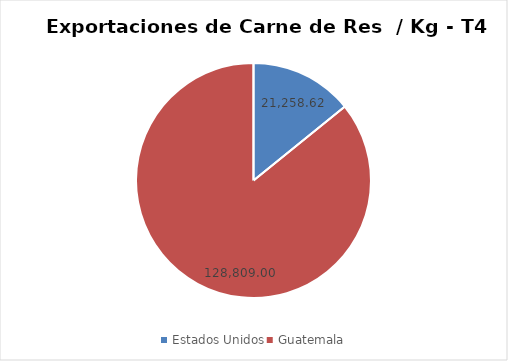
| Category | Series 0 |
|---|---|
| Estados Unidos | 21258.62 |
| Guatemala | 128809 |